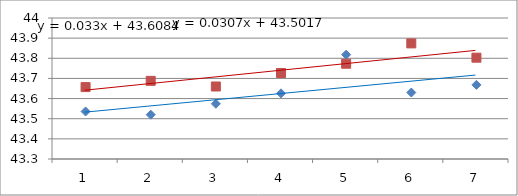
| Category | Series 0 | Series 1 |
|---|---|---|
| 0 | 43.536 | 43.657 |
| 1 | 43.52 | 43.688 |
| 2 | 43.574 | 43.66 |
| 3 | 43.626 | 43.727 |
| 4 | 43.818 | 43.773 |
| 5 | 43.63 | 43.874 |
| 6 | 43.668 | 43.803 |